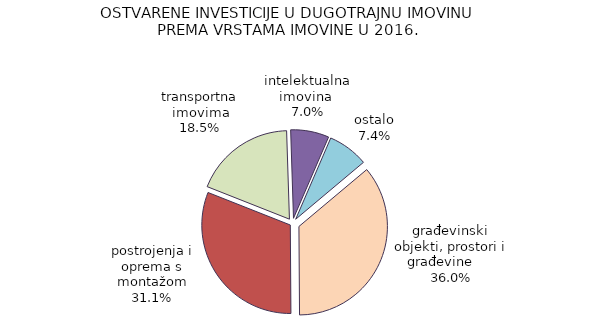
| Category | Series 0 |
|---|---|
| građevinski objekti, prostori i građevine      | 36 |
| postrojenja i oprema s montažom | 31.1 |
| transportna imovima | 18.5 |
| intelektualna imovina  | 7 |
| ostalo | 7.4 |